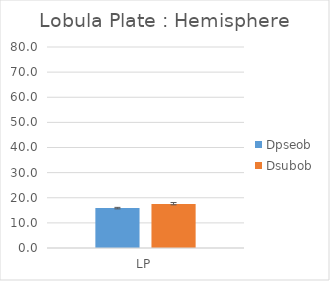
| Category | Dpseob | Dsubob |
|---|---|---|
| LP | 15.875 | 17.484 |